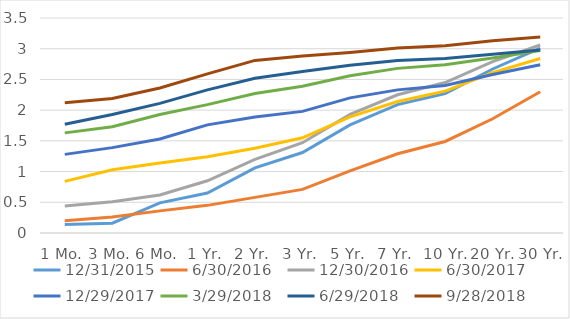
| Category | 12/31/2015 | 6/30/2016 | 12/30/2016 | 6/30/2017 | 12/29/2017 | 3/29/2018 | 6/29/2018 | 9/28/2018 |
|---|---|---|---|---|---|---|---|---|
| 1 Mo. | 0.14 | 0.2 | 0.44 | 0.84 | 1.28 | 1.63 | 1.77 | 2.12 |
| 3 Mo. | 0.16 | 0.26 | 0.51 | 1.03 | 1.39 | 1.73 | 1.93 | 2.19 |
| 6 Mo. | 0.49 | 0.36 | 0.62 | 1.14 | 1.53 | 1.93 | 2.11 | 2.36 |
| 1 Yr. | 0.65 | 0.45 | 0.85 | 1.24 | 1.76 | 2.09 | 2.33 | 2.59 |
| 2 Yr. | 1.06 | 0.58 | 1.2 | 1.38 | 1.89 | 2.27 | 2.52 | 2.81 |
| 3 Yr. | 1.31 | 0.71 | 1.47 | 1.55 | 1.98 | 2.39 | 2.63 | 2.88 |
| 5 Yr. | 1.76 | 1.01 | 1.93 | 1.89 | 2.2 | 2.56 | 2.73 | 2.94 |
| 7 Yr. | 2.09 | 1.29 | 2.25 | 2.14 | 2.33 | 2.68 | 2.81 | 3.01 |
| 10 Yr. | 2.27 | 1.49 | 2.45 | 2.31 | 2.4 | 2.74 | 2.84 | 3.05 |
| 20 Yr. | 2.67 | 1.86 | 2.79 | 2.61 | 2.58 | 2.85 | 2.91 | 3.13 |
| 30 Yr. | 3.01 | 2.3 | 3.06 | 2.84 | 2.74 | 2.97 | 2.98 | 3.19 |